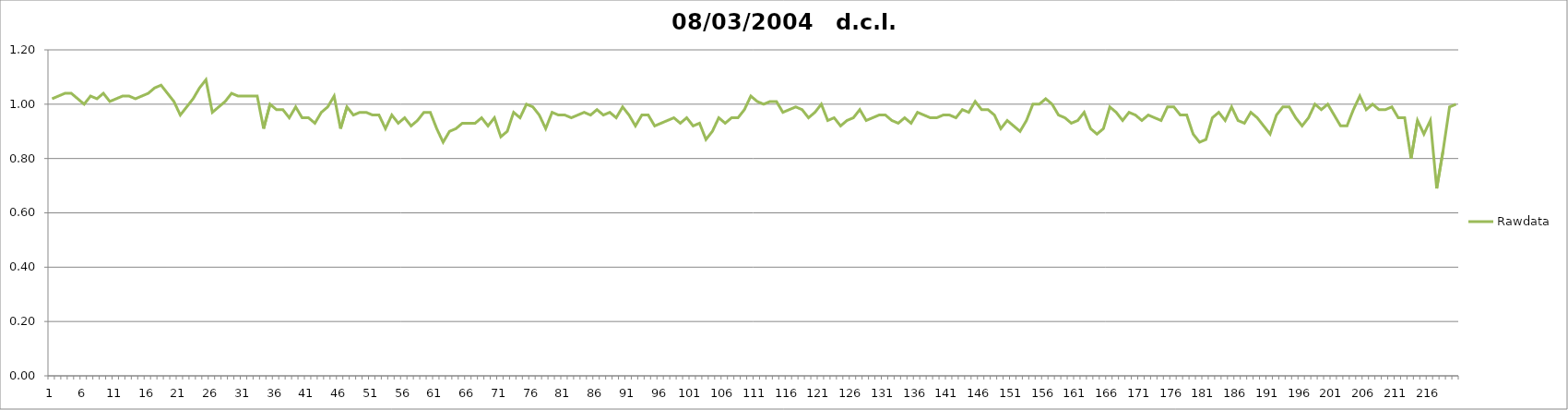
| Category | Rawdata |
|---|---|
| 0 | 1.02 |
| 1 | 1.03 |
| 2 | 1.04 |
| 3 | 1.04 |
| 4 | 1.02 |
| 5 | 1 |
| 6 | 1.03 |
| 7 | 1.02 |
| 8 | 1.04 |
| 9 | 1.01 |
| 10 | 1.02 |
| 11 | 1.03 |
| 12 | 1.03 |
| 13 | 1.02 |
| 14 | 1.03 |
| 15 | 1.04 |
| 16 | 1.06 |
| 17 | 1.07 |
| 18 | 1.04 |
| 19 | 1.01 |
| 20 | 0.96 |
| 21 | 0.99 |
| 22 | 1.02 |
| 23 | 1.06 |
| 24 | 1.09 |
| 25 | 0.97 |
| 26 | 0.99 |
| 27 | 1.01 |
| 28 | 1.04 |
| 29 | 1.03 |
| 30 | 1.03 |
| 31 | 1.03 |
| 32 | 1.03 |
| 33 | 0.91 |
| 34 | 1 |
| 35 | 0.98 |
| 36 | 0.98 |
| 37 | 0.95 |
| 38 | 0.99 |
| 39 | 0.95 |
| 40 | 0.95 |
| 41 | 0.93 |
| 42 | 0.97 |
| 43 | 0.99 |
| 44 | 1.03 |
| 45 | 0.91 |
| 46 | 0.99 |
| 47 | 0.96 |
| 48 | 0.97 |
| 49 | 0.97 |
| 50 | 0.96 |
| 51 | 0.96 |
| 52 | 0.91 |
| 53 | 0.96 |
| 54 | 0.93 |
| 55 | 0.95 |
| 56 | 0.92 |
| 57 | 0.94 |
| 58 | 0.97 |
| 59 | 0.97 |
| 60 | 0.91 |
| 61 | 0.86 |
| 62 | 0.9 |
| 63 | 0.91 |
| 64 | 0.93 |
| 65 | 0.93 |
| 66 | 0.93 |
| 67 | 0.95 |
| 68 | 0.92 |
| 69 | 0.95 |
| 70 | 0.88 |
| 71 | 0.9 |
| 72 | 0.97 |
| 73 | 0.95 |
| 74 | 1 |
| 75 | 0.99 |
| 76 | 0.96 |
| 77 | 0.91 |
| 78 | 0.97 |
| 79 | 0.96 |
| 80 | 0.96 |
| 81 | 0.95 |
| 82 | 0.96 |
| 83 | 0.97 |
| 84 | 0.96 |
| 85 | 0.98 |
| 86 | 0.96 |
| 87 | 0.97 |
| 88 | 0.95 |
| 89 | 0.99 |
| 90 | 0.96 |
| 91 | 0.92 |
| 92 | 0.96 |
| 93 | 0.96 |
| 94 | 0.92 |
| 95 | 0.93 |
| 96 | 0.94 |
| 97 | 0.95 |
| 98 | 0.93 |
| 99 | 0.95 |
| 100 | 0.92 |
| 101 | 0.93 |
| 102 | 0.87 |
| 103 | 0.9 |
| 104 | 0.95 |
| 105 | 0.93 |
| 106 | 0.95 |
| 107 | 0.95 |
| 108 | 0.98 |
| 109 | 1.03 |
| 110 | 1.01 |
| 111 | 1 |
| 112 | 1.01 |
| 113 | 1.01 |
| 114 | 0.97 |
| 115 | 0.98 |
| 116 | 0.99 |
| 117 | 0.98 |
| 118 | 0.95 |
| 119 | 0.97 |
| 120 | 1 |
| 121 | 0.94 |
| 122 | 0.95 |
| 123 | 0.92 |
| 124 | 0.94 |
| 125 | 0.95 |
| 126 | 0.98 |
| 127 | 0.94 |
| 128 | 0.95 |
| 129 | 0.96 |
| 130 | 0.96 |
| 131 | 0.94 |
| 132 | 0.93 |
| 133 | 0.95 |
| 134 | 0.93 |
| 135 | 0.97 |
| 136 | 0.96 |
| 137 | 0.95 |
| 138 | 0.95 |
| 139 | 0.96 |
| 140 | 0.96 |
| 141 | 0.95 |
| 142 | 0.98 |
| 143 | 0.97 |
| 144 | 1.01 |
| 145 | 0.98 |
| 146 | 0.98 |
| 147 | 0.96 |
| 148 | 0.91 |
| 149 | 0.94 |
| 150 | 0.92 |
| 151 | 0.9 |
| 152 | 0.94 |
| 153 | 1 |
| 154 | 1 |
| 155 | 1.02 |
| 156 | 1 |
| 157 | 0.96 |
| 158 | 0.95 |
| 159 | 0.93 |
| 160 | 0.94 |
| 161 | 0.97 |
| 162 | 0.91 |
| 163 | 0.89 |
| 164 | 0.91 |
| 165 | 0.99 |
| 166 | 0.97 |
| 167 | 0.94 |
| 168 | 0.97 |
| 169 | 0.96 |
| 170 | 0.94 |
| 171 | 0.96 |
| 172 | 0.95 |
| 173 | 0.94 |
| 174 | 0.99 |
| 175 | 0.99 |
| 176 | 0.96 |
| 177 | 0.96 |
| 178 | 0.89 |
| 179 | 0.86 |
| 180 | 0.87 |
| 181 | 0.95 |
| 182 | 0.97 |
| 183 | 0.94 |
| 184 | 0.99 |
| 185 | 0.94 |
| 186 | 0.93 |
| 187 | 0.97 |
| 188 | 0.95 |
| 189 | 0.92 |
| 190 | 0.89 |
| 191 | 0.96 |
| 192 | 0.99 |
| 193 | 0.99 |
| 194 | 0.95 |
| 195 | 0.92 |
| 196 | 0.95 |
| 197 | 1 |
| 198 | 0.98 |
| 199 | 1 |
| 200 | 0.96 |
| 201 | 0.92 |
| 202 | 0.92 |
| 203 | 0.98 |
| 204 | 1.03 |
| 205 | 0.98 |
| 206 | 1 |
| 207 | 0.98 |
| 208 | 0.98 |
| 209 | 0.99 |
| 210 | 0.95 |
| 211 | 0.95 |
| 212 | 0.8 |
| 213 | 0.94 |
| 214 | 0.89 |
| 215 | 0.94 |
| 216 | 0.69 |
| 217 | 0.83 |
| 218 | 0.99 |
| 219 | 1 |